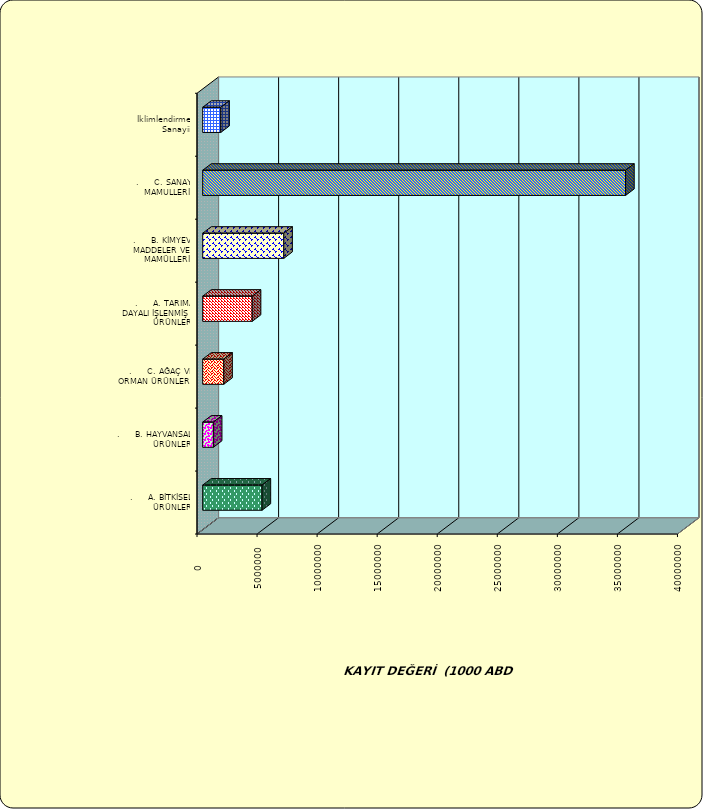
| Category | Series 0 |
|---|---|
| .     A. BİTKİSEL ÜRÜNLER | 4942306.598 |
| .     B. HAYVANSAL ÜRÜNLER | 887521.994 |
| .     C. AĞAÇ VE ORMAN ÜRÜNLERİ | 1753886.512 |
| .     A. TARIMA DAYALI İŞLENMİŞ ÜRÜNLER | 4124465.74 |
| .     B. KİMYEVİ MADDELER VE MAMÜLLERİ | 6751626.676 |
| .     C. SANAYİ MAMULLERİ | 35208944.878 |
|  İklimlendirme Sanayii | 1505085.66 |